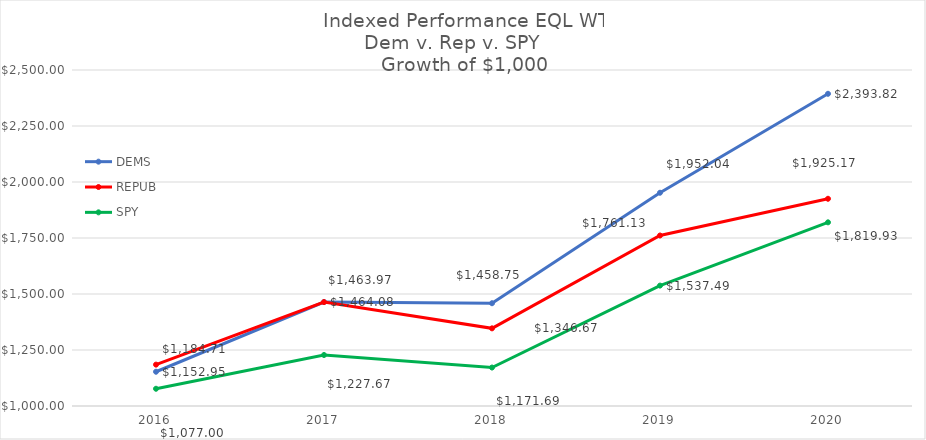
| Category | DEMS | REPUB | SPY |
|---|---|---|---|
| 2020.0 | 2393.817 | 1925.169 | 1819.93 |
| 2019.0 | 1952.041 | 1761.133 | 1537.492 |
| 2018.0 | 1458.747 | 1346.674 | 1171.69 |
| 2017.0 | 1464.085 | 1463.967 | 1227.672 |
| 2016.0 | 1152.948 | 1184.706 | 1077 |